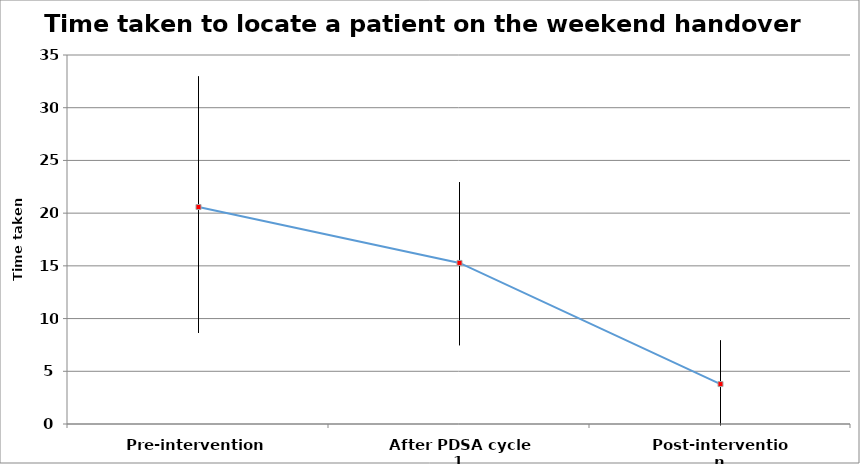
| Category | 95% HI | 95% LO | Average Time |
|---|---|---|---|
| Pre-intervention | 32.959 | 8.641 | 20.58 |
| After PDSA cycle 1 | 22.926 | 7.474 | 15.277 |
| Post-intervention | 7.917 | -0.117 | 3.787 |